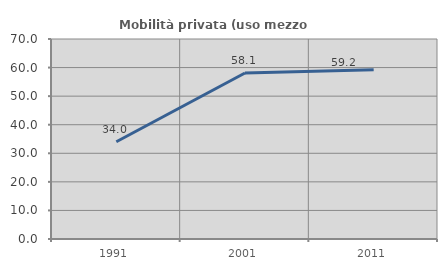
| Category | Mobilità privata (uso mezzo privato) |
|---|---|
| 1991.0 | 34.03 |
| 2001.0 | 58.087 |
| 2011.0 | 59.243 |